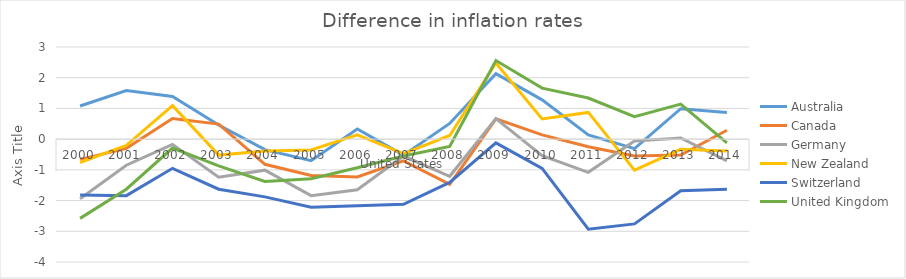
| Category | Australia | Canada | Germany | New Zealand | Switzerland | United Kingdom |
|---|---|---|---|---|---|---|
| 0 | 1.08 | -0.66 | -1.94 | -0.76 | -1.82 | -2.58 |
| 1 | 1.58 | -0.3 | -0.85 | -0.2 | -1.84 | -1.63 |
| 2 | 1.39 | 0.67 | -0.17 | 1.09 | -0.95 | -0.29 |
| 3 | 0.46 | 0.49 | -1.24 | -0.52 | -1.63 | -0.87 |
| 4 | -0.34 | -0.82 | -1.01 | -0.39 | -1.88 | -1.38 |
| 5 | -0.7 | -1.18 | -1.84 | -0.35 | -2.22 | -1.29 |
| 6 | 0.33 | -1.23 | -1.65 | 0.14 | -2.17 | -0.93 |
| 7 | -0.52 | -0.71 | -0.55 | -0.47 | -2.12 | -0.55 |
| 8 | 0.51 | -1.47 | -1.21 | 0.12 | -1.41 | -0.24 |
| 9 | 2.13 | 0.66 | 0.67 | 2.48 | -0.12 | 2.56 |
| 10 | 1.28 | 0.14 | -0.54 | 0.66 | -0.95 | 1.66 |
| 11 | 0.14 | -0.25 | -1.08 | 0.87 | -2.93 | 1.34 |
| 12 | -0.31 | -0.55 | -0.06 | -1.01 | -2.76 | 0.73 |
| 13 | 0.99 | -0.52 | 0.04 | -0.33 | -1.68 | 1.14 |
| 14 | 0.87 | 0.29 | -0.71 | -0.39 | -1.63 | -0.12 |